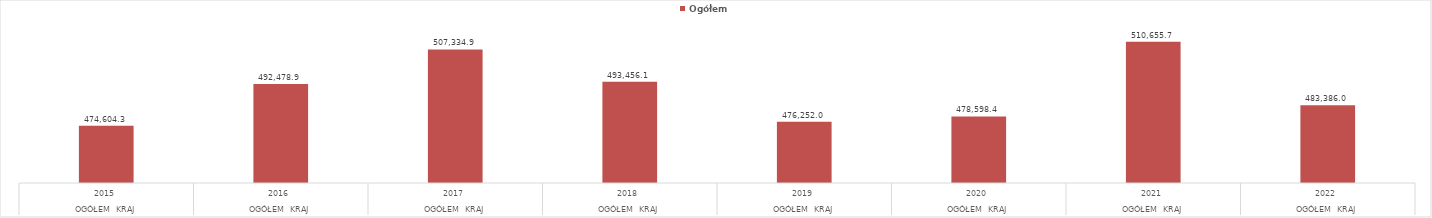
| Category | Ogółem |
|---|---|
| 0 | 474604.3 |
| 1 | 492478.9 |
| 2 | 507334.9 |
| 3 | 493456.1 |
| 4 | 476252 |
| 5 | 478598.4 |
| 6 | 510655.7 |
| 7 | 483386 |